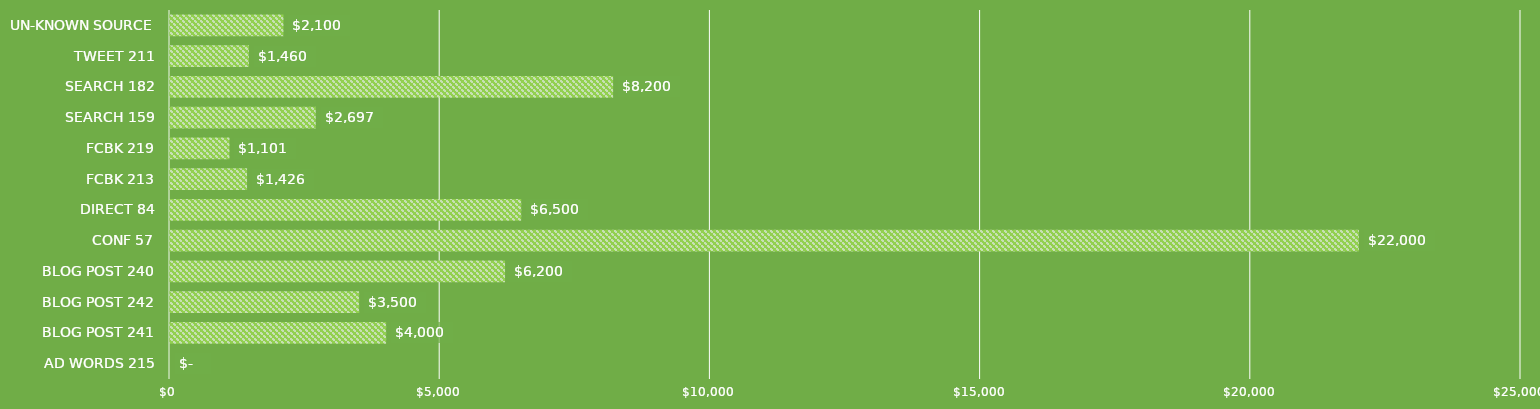
| Category | Series 0 |
|---|---|
| AD WORDS 215 | 0 |
| BLOG POST 241 | 4000 |
| BLOG POST 242 | 3500 |
| BLOG POST 240 | 6200 |
| CONF 57 | 22000 |
| DIRECT 84 | 6500 |
| FCBK 213 | 1426 |
| FCBK 219 | 1101 |
| SEARCH 159 | 2697 |
| SEARCH 182 | 8200 |
| TWEET 211 | 1460 |
| UN-KNOWN SOURCE | 2100 |